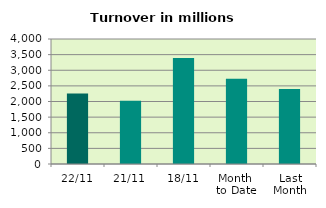
| Category | Series 0 |
|---|---|
| 22/11 | 2259.702 |
| 21/11 | 2024.599 |
| 18/11 | 3393.156 |
| Month 
to Date | 2728.044 |
| Last
Month | 2399.244 |